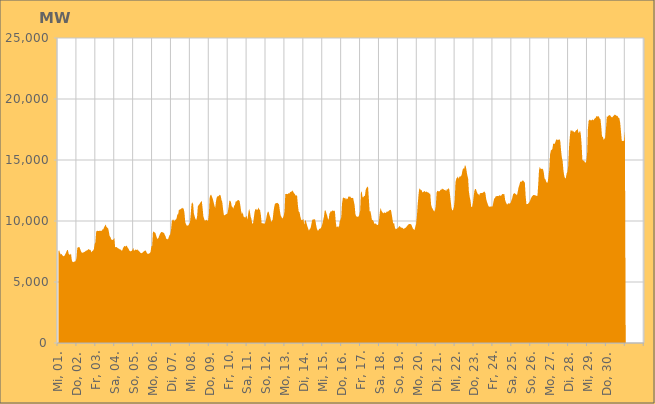
| Category | Series 0 |
|---|---|
|  Mi, 01.  | 7530.086 |
|  Mi, 01.  | 7598.957 |
|  Mi, 01.  | 7381.855 |
|  Mi, 01.  | 7246.547 |
|  Mi, 01.  | 7308.472 |
|  Mi, 01.  | 7187.85 |
|  Mi, 01.  | 7132.111 |
|  Mi, 01.  | 7106.708 |
|  Mi, 01.  | 7186.38 |
|  Mi, 01.  | 7316.976 |
|  Mi, 01.  | 7448.877 |
|  Mi, 01.  | 7607.524 |
|  Mi, 01.  | 7634.783 |
|  Mi, 01.  | 7328.757 |
|  Mi, 01.  | 7240.696 |
|  Mi, 01.  | 7236.433 |
|  Mi, 01.  | 7337.167 |
|  Do, 02.  | 6790.311 |
|  Do, 02.  | 6642.251 |
|  Do, 02.  | 6624.291 |
|  Do, 02.  | 6676.394 |
|  Do, 02.  | 6668.428 |
|  Do, 02.  | 6733.817 |
|  Do, 02.  | 6961.467 |
|  Do, 02.  | 7804.432 |
|  Do, 02.  | 7822.666 |
|  Do, 02.  | 7878.085 |
|  Do, 02.  | 7818.977 |
|  Do, 02.  | 7639.762 |
|  Do, 02.  | 7467.367 |
|  Do, 02.  | 7388.343 |
|  Do, 02.  | 7408.284 |
|  Do, 02.  | 7427.965 |
|  Do, 02.  | 7467.24 |
|  Do, 02.  | 7500.736 |
|  Do, 02.  | 7565.007 |
|  Do, 02.  | 7584.925 |
|  Do, 02.  | 7615.402 |
|  Do, 02.  | 7705.241 |
|  Do, 02.  | 7649.032 |
|  Do, 02.  | 7655.462 |
|  Fr, 03.  | 7601 |
|  Fr, 03.  | 7427.097 |
|  Fr, 03.  | 7535.312 |
|  Fr, 03.  | 7577.348 |
|  Fr, 03.  | 7699.292 |
|  Fr, 03.  | 8100.444 |
|  Fr, 03.  | 8269.262 |
|  Fr, 03.  | 9148.528 |
|  Fr, 03.  | 9179.667 |
|  Fr, 03.  | 9205.614 |
|  Fr, 03.  | 9169.185 |
|  Fr, 03.  | 9202.88 |
|  Fr, 03.  | 9170.473 |
|  Fr, 03.  | 9227.658 |
|  Fr, 03.  | 9167.51 |
|  Fr, 03.  | 9313.865 |
|  Fr, 03.  | 9314.967 |
|  Fr, 03.  | 9481.64 |
|  Fr, 03.  | 9599.318 |
|  Fr, 03.  | 9722.688 |
|  Fr, 03.  | 9517.918 |
|  Fr, 03.  | 9453.129 |
|  Fr, 03.  | 9406.342 |
|  Fr, 03.  | 9153.004 |
|  Sa, 04.  | 8768.925 |
|  Sa, 04.  | 8689.642 |
|  Sa, 04.  | 8521.003 |
|  Sa, 04.  | 8436.385 |
|  Sa, 04.  | 8467.394 |
|  Sa, 04.  | 8493.562 |
|  Sa, 04.  | 8609.007 |
|  Sa, 04.  | 7862.944 |
|  Sa, 04.  | 7851.884 |
|  Sa, 04.  | 7870.968 |
|  Sa, 04.  | 7793.414 |
|  Sa, 04.  | 7746.976 |
|  Sa, 04.  | 7734.626 |
|  Sa, 04.  | 7662.555 |
|  Sa, 04.  | 7665.306 |
|  Sa, 04.  | 7571.384 |
|  Sa, 04.  | 7582.832 |
|  Sa, 04.  | 7773.969 |
|  Sa, 04.  | 7890.776 |
|  Sa, 04.  | 7959.181 |
|  Sa, 04.  | 7892.688 |
|  Sa, 04.  | 7985.051 |
|  Sa, 04.  | 7942.774 |
|  Sa, 04.  | 7811.904 |
|  So, 05.  | 7723.871 |
|  So, 05.  | 7577.383 |
|  So, 05.  | 7522.685 |
|  So, 05.  | 7523.303 |
|  So, 05.  | 7549.055 |
|  So, 05.  | 7640.279 |
|  So, 05.  | 7801.134 |
|  So, 05.  | 7562.498 |
|  So, 05.  | 7623.81 |
|  So, 05.  | 7671.449 |
|  So, 05.  | 7614.067 |
|  So, 05.  | 7674.715 |
|  So, 05.  | 7601.444 |
|  So, 05.  | 7553.996 |
|  So, 05.  | 7495.488 |
|  So, 05.  | 7393.287 |
|  So, 05.  | 7381.973 |
|  So, 05.  | 7355.919 |
|  So, 05.  | 7424.539 |
|  So, 05.  | 7481.556 |
|  So, 05.  | 7535.882 |
|  So, 05.  | 7572.455 |
|  So, 05.  | 7570.993 |
|  So, 05.  | 7411.748 |
|  Mo, 06.  | 7309.843 |
|  Mo, 06.  | 7303.058 |
|  Mo, 06.  | 7342.113 |
|  Mo, 06.  | 7362.354 |
|  Mo, 06.  | 7471.255 |
|  Mo, 06.  | 7918.371 |
|  Mo, 06.  | 7980.767 |
|  Mo, 06.  | 9108.532 |
|  Mo, 06.  | 9132.955 |
|  Mo, 06.  | 9063.609 |
|  Mo, 06.  | 9030.41 |
|  Mo, 06.  | 8826.513 |
|  Mo, 06.  | 8628.786 |
|  Mo, 06.  | 8522.48 |
|  Mo, 06.  | 8615.455 |
|  Mo, 06.  | 8798.992 |
|  Mo, 06.  | 8934.601 |
|  Mo, 06.  | 9056.447 |
|  Mo, 06.  | 9101.433 |
|  Mo, 06.  | 9083.913 |
|  Mo, 06.  | 9040.18 |
|  Mo, 06.  | 9039.7 |
|  Mo, 06.  | 8862.589 |
|  Mo, 06.  | 8745.44 |
|  Di, 07.  | 8523.883 |
|  Di, 07.  | 8545.072 |
|  Di, 07.  | 8485.145 |
|  Di, 07.  | 8657.091 |
|  Di, 07.  | 8845.719 |
|  Di, 07.  | 8917.378 |
|  Di, 07.  | 9299.945 |
|  Di, 07.  | 9979.365 |
|  Di, 07.  | 10096.828 |
|  Di, 07.  | 10115.042 |
|  Di, 07.  | 9960.373 |
|  Di, 07.  | 10123.494 |
|  Di, 07.  | 10084.869 |
|  Di, 07.  | 10231.654 |
|  Di, 07.  | 10538.052 |
|  Di, 07.  | 10551.075 |
|  Di, 07.  | 10937.497 |
|  Di, 07.  | 10915.25 |
|  Di, 07.  | 10976.538 |
|  Di, 07.  | 10999.376 |
|  Di, 07.  | 11097.182 |
|  Di, 07.  | 11017.492 |
|  Di, 07.  | 11012.376 |
|  Di, 07.  | 10666.227 |
|  Mi, 08.  | 9895.161 |
|  Mi, 08.  | 9732.192 |
|  Mi, 08.  | 9618.947 |
|  Mi, 08.  | 9623.242 |
|  Mi, 08.  | 9645.638 |
|  Mi, 08.  | 9770.531 |
|  Mi, 08.  | 9852.334 |
|  Mi, 08.  | 10610.2 |
|  Mi, 08.  | 11404.455 |
|  Mi, 08.  | 11539.007 |
|  Mi, 08.  | 11369.776 |
|  Mi, 08.  | 10598.371 |
|  Mi, 08.  | 10364.366 |
|  Mi, 08.  | 10163.645 |
|  Mi, 08.  | 10089.832 |
|  Mi, 08.  | 10352.927 |
|  Mi, 08.  | 11195.339 |
|  Mi, 08.  | 11306.627 |
|  Mi, 08.  | 11376.223 |
|  Mi, 08.  | 11491.323 |
|  Mi, 08.  | 11576.411 |
|  Mi, 08.  | 11652.177 |
|  Mi, 08.  | 11060.784 |
|  Mi, 08.  | 10394.817 |
|  Do, 09.  | 10171.512 |
|  Do, 09.  | 10015.112 |
|  Do, 09.  | 10066.481 |
|  Do, 09.  | 10104.661 |
|  Do, 09.  | 10015.343 |
|  Do, 09.  | 10059.952 |
|  Do, 09.  | 10565.508 |
|  Do, 09.  | 11939.602 |
|  Do, 09.  | 12139.774 |
|  Do, 09.  | 12145.853 |
|  Do, 09.  | 11971.897 |
|  Do, 09.  | 11796.356 |
|  Do, 09.  | 11544.458 |
|  Do, 09.  | 11276.372 |
|  Do, 09.  | 11064.131 |
|  Do, 09.  | 11630.556 |
|  Do, 09.  | 11938.928 |
|  Do, 09.  | 12025.891 |
|  Do, 09.  | 12016.727 |
|  Do, 09.  | 12105.47 |
|  Do, 09.  | 12153.755 |
|  Do, 09.  | 12066.862 |
|  Do, 09.  | 11718.805 |
|  Do, 09.  | 11560.945 |
|  Fr, 10.  | 10965.375 |
|  Fr, 10.  | 10503.033 |
|  Fr, 10.  | 10467.214 |
|  Fr, 10.  | 10514.347 |
|  Fr, 10.  | 10580.488 |
|  Fr, 10.  | 10549.59 |
|  Fr, 10.  | 10743.511 |
|  Fr, 10.  | 11142.487 |
|  Fr, 10.  | 11651.96 |
|  Fr, 10.  | 11669.336 |
|  Fr, 10.  | 11550.012 |
|  Fr, 10.  | 11197.84 |
|  Fr, 10.  | 11154.378 |
|  Fr, 10.  | 11014.476 |
|  Fr, 10.  | 11241.822 |
|  Fr, 10.  | 11304.047 |
|  Fr, 10.  | 11605.48 |
|  Fr, 10.  | 11606.98 |
|  Fr, 10.  | 11680.638 |
|  Fr, 10.  | 11701.602 |
|  Fr, 10.  | 11721.901 |
|  Fr, 10.  | 11618.131 |
|  Fr, 10.  | 11236.851 |
|  Fr, 10.  | 10787.876 |
|  Sa, 11.  | 10551.212 |
|  Sa, 11.  | 10719.049 |
|  Sa, 11.  | 10374.413 |
|  Sa, 11.  | 10333.383 |
|  Sa, 11.  | 10269.768 |
|  Sa, 11.  | 10345.735 |
|  Sa, 11.  | 10435.162 |
|  Sa, 11.  | 10094.217 |
|  Sa, 11.  | 10636.831 |
|  Sa, 11.  | 10997.85 |
|  Sa, 11.  | 10788.256 |
|  Sa, 11.  | 10366.771 |
|  Sa, 11.  | 10158.948 |
|  Sa, 11.  | 9799.451 |
|  Sa, 11.  | 9774.561 |
|  Sa, 11.  | 10249.842 |
|  Sa, 11.  | 10752.495 |
|  Sa, 11.  | 10956.738 |
|  Sa, 11.  | 11003.972 |
|  Sa, 11.  | 10880.094 |
|  Sa, 11.  | 10963.712 |
|  Sa, 11.  | 11103.233 |
|  Sa, 11.  | 10945.748 |
|  Sa, 11.  | 10889.643 |
|  So, 12.  | 10482.925 |
|  So, 12.  | 9802.614 |
|  So, 12.  | 9814.62 |
|  So, 12.  | 9804.62 |
|  So, 12.  | 9799.581 |
|  So, 12.  | 9778.026 |
|  So, 12.  | 9999.276 |
|  So, 12.  | 10293.961 |
|  So, 12.  | 10619.178 |
|  So, 12.  | 10783.852 |
|  So, 12.  | 10721.929 |
|  So, 12.  | 10462.9 |
|  So, 12.  | 10284.989 |
|  So, 12.  | 9931.332 |
|  So, 12.  | 9997.8 |
|  So, 12.  | 10142.525 |
|  So, 12.  | 10769.572 |
|  So, 12.  | 11176.794 |
|  So, 12.  | 11450.334 |
|  So, 12.  | 11435.361 |
|  So, 12.  | 11481.807 |
|  So, 12.  | 11486.507 |
|  So, 12.  | 11426.865 |
|  So, 12.  | 11371.686 |
|  Mo, 13.  | 10879.438 |
|  Mo, 13.  | 10484.812 |
|  Mo, 13.  | 10356.553 |
|  Mo, 13.  | 10208.094 |
|  Mo, 13.  | 10277.631 |
|  Mo, 13.  | 10422.358 |
|  Mo, 13.  | 10791.965 |
|  Mo, 13.  | 12210.797 |
|  Mo, 13.  | 12224.518 |
|  Mo, 13.  | 12217.777 |
|  Mo, 13.  | 12199.488 |
|  Mo, 13.  | 12279.368 |
|  Mo, 13.  | 12247.273 |
|  Mo, 13.  | 12352.411 |
|  Mo, 13.  | 12389.765 |
|  Mo, 13.  | 12421.065 |
|  Mo, 13.  | 12500.101 |
|  Mo, 13.  | 12403.932 |
|  Mo, 13.  | 12271.654 |
|  Mo, 13.  | 12227.52 |
|  Mo, 13.  | 12077.737 |
|  Mo, 13.  | 12132.157 |
|  Mo, 13.  | 12017.593 |
|  Mo, 13.  | 11272.062 |
|  Di, 14.  | 10764.153 |
|  Di, 14.  | 10729.307 |
|  Di, 14.  | 10386.311 |
|  Di, 14.  | 10136.546 |
|  Di, 14.  | 10064.527 |
|  Di, 14.  | 10101.753 |
|  Di, 14.  | 10172.503 |
|  Di, 14.  | 9667.354 |
|  Di, 14.  | 10060.009 |
|  Di, 14.  | 10035.853 |
|  Di, 14.  | 9790.108 |
|  Di, 14.  | 9560.208 |
|  Di, 14.  | 9374.483 |
|  Di, 14.  | 9210.078 |
|  Di, 14.  | 9350.314 |
|  Di, 14.  | 9404.19 |
|  Di, 14.  | 9705.449 |
|  Di, 14.  | 10046.022 |
|  Di, 14.  | 10144.27 |
|  Di, 14.  | 10115.965 |
|  Di, 14.  | 10151.485 |
|  Di, 14.  | 10086.649 |
|  Di, 14.  | 9713.621 |
|  Di, 14.  | 9392.463 |
|  Mi, 15.  | 9229.256 |
|  Mi, 15.  | 9211.125 |
|  Mi, 15.  | 9358.288 |
|  Mi, 15.  | 9362.337 |
|  Mi, 15.  | 9409.605 |
|  Mi, 15.  | 9530.224 |
|  Mi, 15.  | 9754.821 |
|  Mi, 15.  | 10047.467 |
|  Mi, 15.  | 10351.795 |
|  Mi, 15.  | 10845.27 |
|  Mi, 15.  | 10881.316 |
|  Mi, 15.  | 10666.061 |
|  Mi, 15.  | 10462.295 |
|  Mi, 15.  | 10200.766 |
|  Mi, 15.  | 10101.71 |
|  Mi, 15.  | 10600.71 |
|  Mi, 15.  | 10712.687 |
|  Mi, 15.  | 10836.118 |
|  Mi, 15.  | 10772.54 |
|  Mi, 15.  | 10894.329 |
|  Mi, 15.  | 10821.471 |
|  Mi, 15.  | 10864.735 |
|  Mi, 15.  | 10774.931 |
|  Mi, 15.  | 9965.973 |
|  Do, 16.  | 9484.647 |
|  Do, 16.  | 9521.321 |
|  Do, 16.  | 9594.113 |
|  Do, 16.  | 9458.248 |
|  Do, 16.  | 9961.22 |
|  Do, 16.  | 10110.633 |
|  Do, 16.  | 10312.547 |
|  Do, 16.  | 11437.953 |
|  Do, 16.  | 11886.275 |
|  Do, 16.  | 11920.634 |
|  Do, 16.  | 11859.517 |
|  Do, 16.  | 11909.859 |
|  Do, 16.  | 11746.588 |
|  Do, 16.  | 11868.636 |
|  Do, 16.  | 11786.854 |
|  Do, 16.  | 12012.142 |
|  Do, 16.  | 11975.552 |
|  Do, 16.  | 12038.806 |
|  Do, 16.  | 11938.631 |
|  Do, 16.  | 11887.154 |
|  Do, 16.  | 11884.081 |
|  Do, 16.  | 11902.134 |
|  Do, 16.  | 11596.186 |
|  Do, 16.  | 11270.773 |
|  Fr, 17.  | 10537.409 |
|  Fr, 17.  | 10394.247 |
|  Fr, 17.  | 10326.953 |
|  Fr, 17.  | 10358.338 |
|  Fr, 17.  | 10364.268 |
|  Fr, 17.  | 10532.344 |
|  Fr, 17.  | 10853.85 |
|  Fr, 17.  | 12400.773 |
|  Fr, 17.  | 12391.935 |
|  Fr, 17.  | 11953.114 |
|  Fr, 17.  | 11935.2 |
|  Fr, 17.  | 12065.12 |
|  Fr, 17.  | 12053.081 |
|  Fr, 17.  | 12549.605 |
|  Fr, 17.  | 12710.216 |
|  Fr, 17.  | 12775.999 |
|  Fr, 17.  | 12834.742 |
|  Fr, 17.  | 11841.383 |
|  Fr, 17.  | 10793.521 |
|  Fr, 17.  | 10816.899 |
|  Fr, 17.  | 10477.127 |
|  Fr, 17.  | 10060.263 |
|  Fr, 17.  | 10105.509 |
|  Fr, 17.  | 9974.775 |
|  Sa, 18.  | 9783.729 |
|  Sa, 18.  | 9780.556 |
|  Sa, 18.  | 9805.832 |
|  Sa, 18.  | 9697.178 |
|  Sa, 18.  | 9667.823 |
|  Sa, 18.  | 9711.164 |
|  Sa, 18.  | 10152.599 |
|  Sa, 18.  | 10749.916 |
|  Sa, 18.  | 11083.641 |
|  Sa, 18.  | 10838.757 |
|  Sa, 18.  | 10735.971 |
|  Sa, 18.  | 10672.62 |
|  Sa, 18.  | 10626.747 |
|  Sa, 18.  | 10725.77 |
|  Sa, 18.  | 10647.036 |
|  Sa, 18.  | 10700.286 |
|  Sa, 18.  | 10795.558 |
|  Sa, 18.  | 10755.661 |
|  Sa, 18.  | 10799.238 |
|  Sa, 18.  | 10885.619 |
|  Sa, 18.  | 10899.514 |
|  Sa, 18.  | 10911.999 |
|  Sa, 18.  | 10578.732 |
|  Sa, 18.  | 10155.338 |
|  So, 19.  | 9764 |
|  So, 19.  | 9852.289 |
|  So, 19.  | 9496.602 |
|  So, 19.  | 9333.649 |
|  So, 19.  | 9352.969 |
|  So, 19.  | 9392.486 |
|  So, 19.  | 9426.707 |
|  So, 19.  | 9522.652 |
|  So, 19.  | 9591.907 |
|  So, 19.  | 9519.111 |
|  So, 19.  | 9446.72 |
|  So, 19.  | 9463.903 |
|  So, 19.  | 9428.64 |
|  So, 19.  | 9346.227 |
|  So, 19.  | 9381.26 |
|  So, 19.  | 9447.165 |
|  So, 19.  | 9445.122 |
|  So, 19.  | 9552.76 |
|  So, 19.  | 9624.494 |
|  So, 19.  | 9705.69 |
|  So, 19.  | 9749.934 |
|  So, 19.  | 9746.313 |
|  So, 19.  | 9745.407 |
|  So, 19.  | 9701.284 |
|  Mo, 20.  | 9524.657 |
|  Mo, 20.  | 9379.488 |
|  Mo, 20.  | 9312.485 |
|  Mo, 20.  | 9262.453 |
|  Mo, 20.  | 9528.713 |
|  Mo, 20.  | 9765.444 |
|  Mo, 20.  | 10398.153 |
|  Mo, 20.  | 11349.89 |
|  Mo, 20.  | 12094.112 |
|  Mo, 20.  | 12662.142 |
|  Mo, 20.  | 12628.896 |
|  Mo, 20.  | 12527.711 |
|  Mo, 20.  | 12534.564 |
|  Mo, 20.  | 12333.87 |
|  Mo, 20.  | 12394.391 |
|  Mo, 20.  | 12394.558 |
|  Mo, 20.  | 12478.722 |
|  Mo, 20.  | 12343.56 |
|  Mo, 20.  | 12432.174 |
|  Mo, 20.  | 12355.44 |
|  Mo, 20.  | 12360.991 |
|  Mo, 20.  | 12301.839 |
|  Mo, 20.  | 12235.218 |
|  Mo, 20.  | 12228.492 |
|  Di, 21.  | 11351.359 |
|  Di, 21.  | 11111.323 |
|  Di, 21.  | 11002.298 |
|  Di, 21.  | 10876.151 |
|  Di, 21.  | 10772.406 |
|  Di, 21.  | 10896.656 |
|  Di, 21.  | 11220.632 |
|  Di, 21.  | 12332.726 |
|  Di, 21.  | 12482.38 |
|  Di, 21.  | 12436.769 |
|  Di, 21.  | 12445.568 |
|  Di, 21.  | 12441.943 |
|  Di, 21.  | 12569.568 |
|  Di, 21.  | 12562.285 |
|  Di, 21.  | 12667.629 |
|  Di, 21.  | 12591.611 |
|  Di, 21.  | 12597.387 |
|  Di, 21.  | 12543.375 |
|  Di, 21.  | 12556.728 |
|  Di, 21.  | 12433.405 |
|  Di, 21.  | 12594.433 |
|  Di, 21.  | 12590.125 |
|  Di, 21.  | 12690.95 |
|  Di, 21.  | 12621.922 |
|  Mi, 22.  | 12176.027 |
|  Mi, 22.  | 11578.598 |
|  Mi, 22.  | 11051.469 |
|  Mi, 22.  | 10854.682 |
|  Mi, 22.  | 10927.002 |
|  Mi, 22.  | 11153.452 |
|  Mi, 22.  | 11752.838 |
|  Mi, 22.  | 13194.988 |
|  Mi, 22.  | 13468.625 |
|  Mi, 22.  | 13540.119 |
|  Mi, 22.  | 13649.166 |
|  Mi, 22.  | 13459.816 |
|  Mi, 22.  | 13651.065 |
|  Mi, 22.  | 13655.572 |
|  Mi, 22.  | 13664.028 |
|  Mi, 22.  | 13838.272 |
|  Mi, 22.  | 14202.049 |
|  Mi, 22.  | 14323.796 |
|  Mi, 22.  | 14288.054 |
|  Mi, 22.  | 14584.088 |
|  Mi, 22.  | 14492.15 |
|  Mi, 22.  | 14140.465 |
|  Mi, 22.  | 13737.407 |
|  Mi, 22.  | 13488.956 |
|  Do, 23.  | 12418.151 |
|  Do, 23.  | 11970.024 |
|  Do, 23.  | 11690.014 |
|  Do, 23.  | 11145.125 |
|  Do, 23.  | 11139.317 |
|  Do, 23.  | 11449.607 |
|  Do, 23.  | 11986.194 |
|  Do, 23.  | 12485.162 |
|  Do, 23.  | 12638.342 |
|  Do, 23.  | 12594.941 |
|  Do, 23.  | 12409.025 |
|  Do, 23.  | 12223.73 |
|  Do, 23.  | 12222.219 |
|  Do, 23.  | 12092.546 |
|  Do, 23.  | 12267.637 |
|  Do, 23.  | 12293.89 |
|  Do, 23.  | 12296.008 |
|  Do, 23.  | 12299.741 |
|  Do, 23.  | 12328.759 |
|  Do, 23.  | 12399.937 |
|  Do, 23.  | 12408.108 |
|  Do, 23.  | 12254.599 |
|  Do, 23.  | 11787.465 |
|  Do, 23.  | 11568.706 |
|  Fr, 24.  | 11358.597 |
|  Fr, 24.  | 11210.518 |
|  Fr, 24.  | 11171.848 |
|  Fr, 24.  | 11177.913 |
|  Fr, 24.  | 11190.757 |
|  Fr, 24.  | 11197.368 |
|  Fr, 24.  | 11192.477 |
|  Fr, 24.  | 11506.365 |
|  Fr, 24.  | 11836.693 |
|  Fr, 24.  | 11864.339 |
|  Fr, 24.  | 12016.733 |
|  Fr, 24.  | 12031.553 |
|  Fr, 24.  | 12062.385 |
|  Fr, 24.  | 12033.1 |
|  Fr, 24.  | 12057.362 |
|  Fr, 24.  | 12119.921 |
|  Fr, 24.  | 12069.477 |
|  Fr, 24.  | 12079.732 |
|  Fr, 24.  | 12190.119 |
|  Fr, 24.  | 12215.862 |
|  Fr, 24.  | 12198.772 |
|  Fr, 24.  | 12194.948 |
|  Fr, 24.  | 11721.389 |
|  Fr, 24.  | 11520.232 |
|  Sa, 25.  | 11388.588 |
|  Sa, 25.  | 11356.579 |
|  Sa, 25.  | 11466.923 |
|  Sa, 25.  | 11422.284 |
|  Sa, 25.  | 11444.891 |
|  Sa, 25.  | 11498.323 |
|  Sa, 25.  | 11704.264 |
|  Sa, 25.  | 11866.037 |
|  Sa, 25.  | 12178.429 |
|  Sa, 25.  | 12243.151 |
|  Sa, 25.  | 12295.381 |
|  Sa, 25.  | 12221.781 |
|  Sa, 25.  | 12190.385 |
|  Sa, 25.  | 12105.109 |
|  Sa, 25.  | 12392.571 |
|  Sa, 25.  | 12756.009 |
|  Sa, 25.  | 12928.617 |
|  Sa, 25.  | 13207.229 |
|  Sa, 25.  | 13216.897 |
|  Sa, 25.  | 13229.714 |
|  Sa, 25.  | 13328.565 |
|  Sa, 25.  | 13322.983 |
|  Sa, 25.  | 13222.93 |
|  Sa, 25.  | 13148.46 |
|  So, 26.  | 12063.559 |
|  So, 26.  | 11376.092 |
|  So, 26.  | 11401.448 |
|  So, 26.  | 11390.846 |
|  So, 26.  | 11500.976 |
|  So, 26.  | 11558.374 |
|  So, 26.  | 11743.704 |
|  So, 26.  | 11885.995 |
|  So, 26.  | 12019.848 |
|  So, 26.  | 12070.903 |
|  So, 26.  | 12133.566 |
|  So, 26.  | 12132.796 |
|  So, 26.  | 12100.883 |
|  So, 26.  | 12092.891 |
|  So, 26.  | 12055.282 |
|  So, 26.  | 12065.067 |
|  So, 26.  | 13008.695 |
|  So, 26.  | 14172.227 |
|  So, 26.  | 14437.996 |
|  So, 26.  | 14278.798 |
|  So, 26.  | 14268.658 |
|  So, 26.  | 14294.102 |
|  So, 26.  | 14242.912 |
|  So, 26.  | 14001.728 |
|  Mo, 27.  | 13481.108 |
|  Mo, 27.  | 13424.73 |
|  Mo, 27.  | 13243.98 |
|  Mo, 27.  | 13131.601 |
|  Mo, 27.  | 13169.647 |
|  Mo, 27.  | 13648.666 |
|  Mo, 27.  | 14202.261 |
|  Mo, 27.  | 15446.688 |
|  Mo, 27.  | 15773.22 |
|  Mo, 27.  | 15826.644 |
|  Mo, 27.  | 15920.705 |
|  Mo, 27.  | 16356.735 |
|  Mo, 27.  | 16328.455 |
|  Mo, 27.  | 16325.353 |
|  Mo, 27.  | 16522.89 |
|  Mo, 27.  | 16706.936 |
|  Mo, 27.  | 16624.422 |
|  Mo, 27.  | 16676.528 |
|  Mo, 27.  | 16646.521 |
|  Mo, 27.  | 16710.076 |
|  Mo, 27.  | 16541.129 |
|  Mo, 27.  | 15761.398 |
|  Mo, 27.  | 15206.558 |
|  Mo, 27.  | 14905.069 |
|  Di, 28.  | 14118.863 |
|  Di, 28.  | 13708.493 |
|  Di, 28.  | 13497.285 |
|  Di, 28.  | 13519.225 |
|  Di, 28.  | 13884.24 |
|  Di, 28.  | 14023.574 |
|  Di, 28.  | 14488.444 |
|  Di, 28.  | 15968.133 |
|  Di, 28.  | 16843.52 |
|  Di, 28.  | 17443.908 |
|  Di, 28.  | 17395.106 |
|  Di, 28.  | 17429.983 |
|  Di, 28.  | 17328.431 |
|  Di, 28.  | 17350.237 |
|  Di, 28.  | 17249.023 |
|  Di, 28.  | 17340.347 |
|  Di, 28.  | 17430.299 |
|  Di, 28.  | 17458.481 |
|  Di, 28.  | 17570.103 |
|  Di, 28.  | 17227.522 |
|  Di, 28.  | 17253.877 |
|  Di, 28.  | 17425.314 |
|  Di, 28.  | 17133.193 |
|  Di, 28.  | 16317.247 |
|  Mi, 29.  | 15038.262 |
|  Mi, 29.  | 14937.884 |
|  Mi, 29.  | 14957.673 |
|  Mi, 29.  | 14837.7 |
|  Mi, 29.  | 14767.264 |
|  Mi, 29.  | 14915.784 |
|  Mi, 29.  | 15482.975 |
|  Mi, 29.  | 17530.035 |
|  Mi, 29.  | 18220.704 |
|  Mi, 29.  | 18299.93 |
|  Mi, 29.  | 18287.756 |
|  Mi, 29.  | 18233.038 |
|  Mi, 29.  | 18267.442 |
|  Mi, 29.  | 18330.426 |
|  Mi, 29.  | 18239.516 |
|  Mi, 29.  | 18350.751 |
|  Mi, 29.  | 18419.791 |
|  Mi, 29.  | 18467.949 |
|  Mi, 29.  | 18610.102 |
|  Mi, 29.  | 18562.175 |
|  Mi, 29.  | 18591.881 |
|  Mi, 29.  | 18555.113 |
|  Mi, 29.  | 18397.842 |
|  Mi, 29.  | 18347.872 |
|  Do, 30.  | 17710.413 |
|  Do, 30.  | 16876.433 |
|  Do, 30.  | 16930.877 |
|  Do, 30.  | 16653.693 |
|  Do, 30.  | 16723.949 |
|  Do, 30.  | 16848.173 |
|  Do, 30.  | 17584.54 |
|  Do, 30.  | 18569.014 |
|  Do, 30.  | 18539.66 |
|  Do, 30.  | 18629.694 |
|  Do, 30.  | 18652.962 |
|  Do, 30.  | 18698.377 |
|  Do, 30.  | 18587.794 |
|  Do, 30.  | 18500.447 |
|  Do, 30.  | 18499.202 |
|  Do, 30.  | 18577.217 |
|  Do, 30.  | 18652.398 |
|  Do, 30.  | 18723.555 |
|  Do, 30.  | 18689.728 |
|  Do, 30.  | 18639.896 |
|  Do, 30.  | 18622.428 |
|  Do, 30.  | 18585.066 |
|  Do, 30.  | 18448.967 |
|  Do, 30.  | 18418.762 |
|  Fr, 01.  | 18041.521 |
|  Fr, 01.  | 17327.935 |
|  Fr, 01.  | 16584.137 |
|  Fr, 01.  | 16555.358 |
|  Fr, 01.  | 16550.388 |
|  Fr, 01.  | 16601.765 |
|    | 17310.15 |
|    | 0 |
|    | 0 |
|    | 0 |
|    | 0 |
|    | 0 |
|    | 0 |
|    | 0 |
|    | 0 |
|    | 0 |
|    | 0 |
|    | 0 |
|    | 0 |
|    | 0 |
|    | 0 |
|    | 0 |
|    | 0 |
|    | 0 |
|    | 0 |
|    | 0 |
|    | 0 |
|    | 0 |
|    | 0 |
|    | 0 |